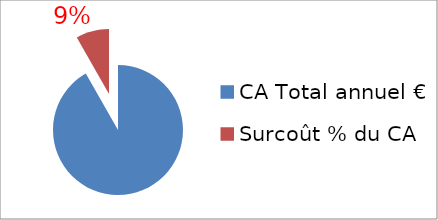
| Category | Series 0 |
|---|---|
| CA Total annuel € | 1 |
| Surcoût % du CA | 0.09 |